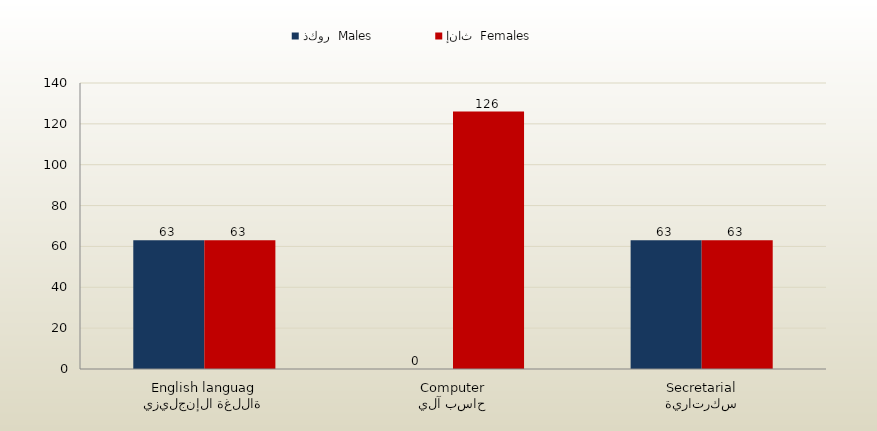
| Category | ذكور  Males | إناث  Females |
|---|---|---|
| اللغة الإنجليزية
English language | 63 | 63 |
| حاسب آلي
Computer | 0 | 126 |
| سكرتارية
Secretarial | 63 | 63 |